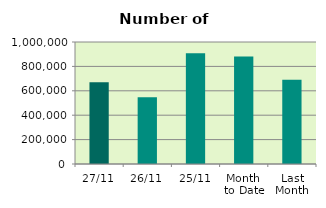
| Category | Series 0 |
|---|---|
| 27/11 | 669500 |
| 26/11 | 546858 |
| 25/11 | 907162 |
| Month 
to Date | 880963.4 |
| Last
Month | 689792.182 |